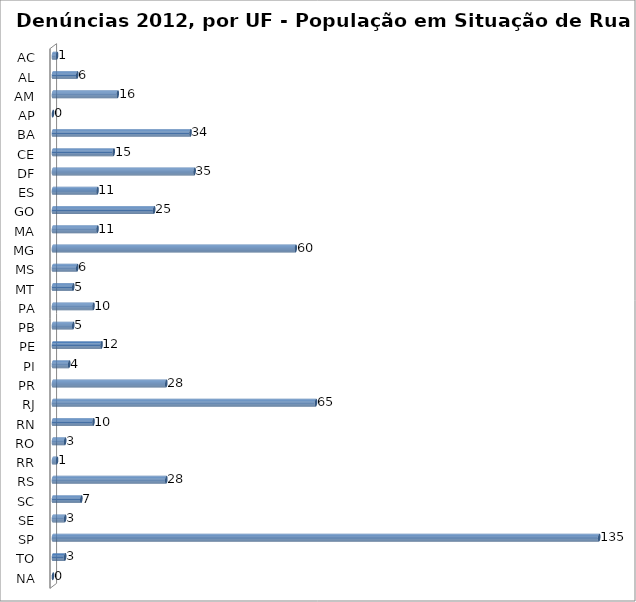
| Category | Series 0 |
|---|---|
| AC | 1 |
| AL | 6 |
| AM | 16 |
| AP | 0 |
| BA | 34 |
| CE | 15 |
| DF | 35 |
| ES | 11 |
| GO | 25 |
| MA | 11 |
| MG | 60 |
| MS | 6 |
| MT | 5 |
| PA | 10 |
| PB | 5 |
| PE | 12 |
| PI | 4 |
| PR | 28 |
| RJ | 65 |
| RN | 10 |
| RO | 3 |
| RR | 1 |
| RS | 28 |
| SC | 7 |
| SE | 3 |
| SP | 135 |
| TO | 3 |
| NA | 0 |